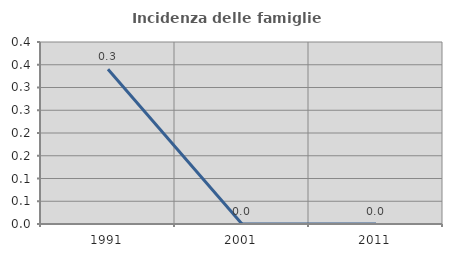
| Category | Incidenza delle famiglie numerose |
|---|---|
| 1991.0 | 0.34 |
| 2001.0 | 0 |
| 2011.0 | 0 |